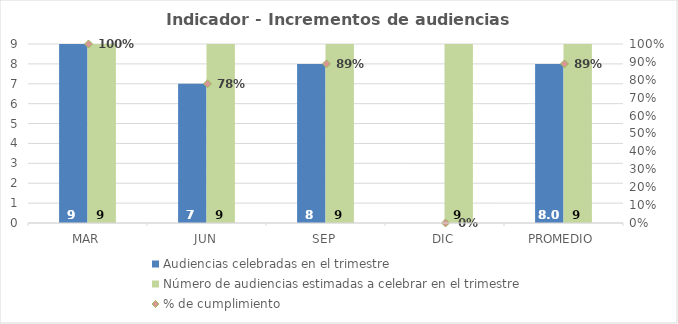
| Category | Audiencias celebradas en el trimestre | Número de audiencias estimadas a celebrar en el trimestre |
|---|---|---|
| MAR | 9 | 9 |
| JUN | 7 | 9 |
| SEP | 8 | 9 |
| DIC | 0 | 9 |
| PROMEDIO | 8 | 9 |